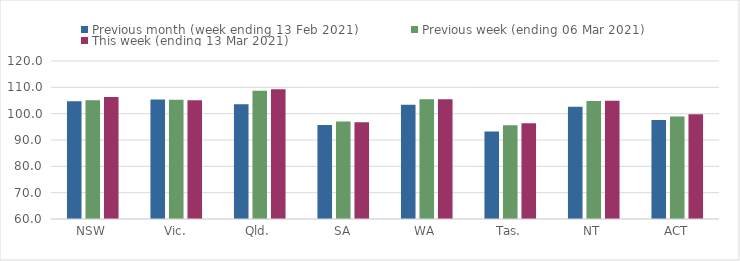
| Category | Previous month (week ending 13 Feb 2021) | Previous week (ending 06 Mar 2021) | This week (ending 13 Mar 2021) |
|---|---|---|---|
| NSW | 104.73 | 105.09 | 106.36 |
| Vic. | 105.39 | 105.28 | 105.11 |
| Qld. | 103.61 | 108.73 | 109.27 |
| SA | 95.65 | 97.04 | 96.73 |
| WA | 103.41 | 105.47 | 105.51 |
| Tas. | 93.21 | 95.63 | 96.37 |
| NT | 102.62 | 104.8 | 104.92 |
| ACT | 97.61 | 98.89 | 99.78 |